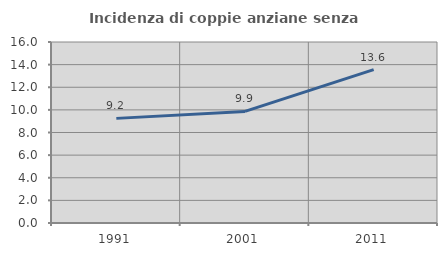
| Category | Incidenza di coppie anziane senza figli  |
|---|---|
| 1991.0 | 9.249 |
| 2001.0 | 9.865 |
| 2011.0 | 13.559 |